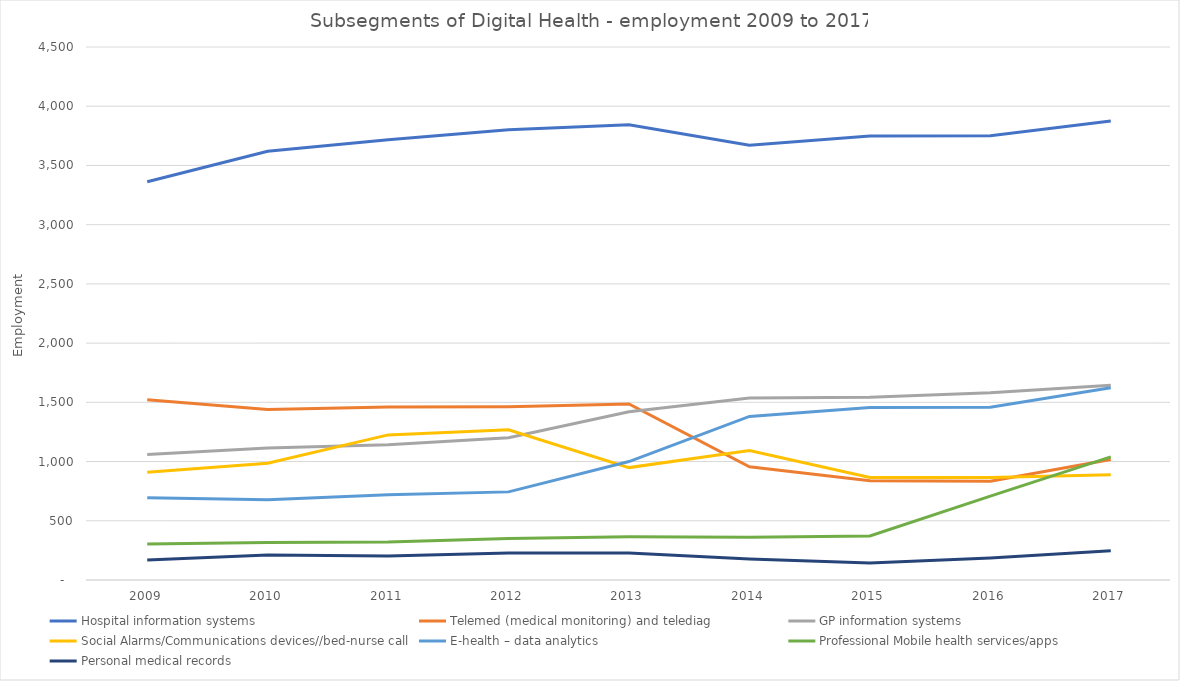
| Category |  Hospital information systems   |  Telemed (medical monitoring) and telediag   |  GP information systems  |  Social Alarms/Communications devices//bed-nurse call  |  E-health – data analytics  |  Professional Mobile health services/apps  |  Personal medical records  |
|---|---|---|---|---|---|---|---|
|  2009  | 3363 | 1522 | 1059 | 909 | 695 | 304 | 168 |
|  2010  | 3619 | 1440 | 1115 | 986 | 678 | 316 | 212 |
|  2011  | 3717 | 1460 | 1141 | 1225 | 720 | 320 | 202 |
|  2012  | 3802 | 1462 | 1201 | 1268 | 744 | 351 | 227 |
|  2013  | 3844 | 1486 | 1420 | 949 | 1000 | 366 | 228 |
|  2014  | 3670 | 956 | 1537 | 1094 | 1381 | 360 | 177 |
|  2015  | 3749 | 837 | 1543 | 865 | 1457 | 372 | 143 |
|  2016  | 3750 | 833 | 1580 | 865 | 1459 | 708 | 185 |
|  2017  | 3875 | 1018 | 1645 | 889 | 1624 | 1039 | 246 |